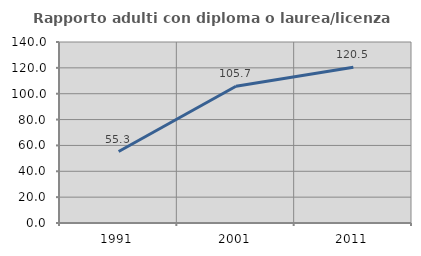
| Category | Rapporto adulti con diploma o laurea/licenza media  |
|---|---|
| 1991.0 | 55.263 |
| 2001.0 | 105.747 |
| 2011.0 | 120.536 |